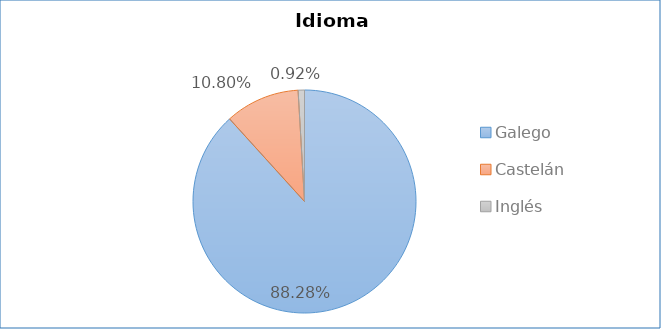
| Category | Idioma empregado |
|---|---|
| Galego | 0.883 |
| Castelán | 0.108 |
| Inglés | 0.009 |